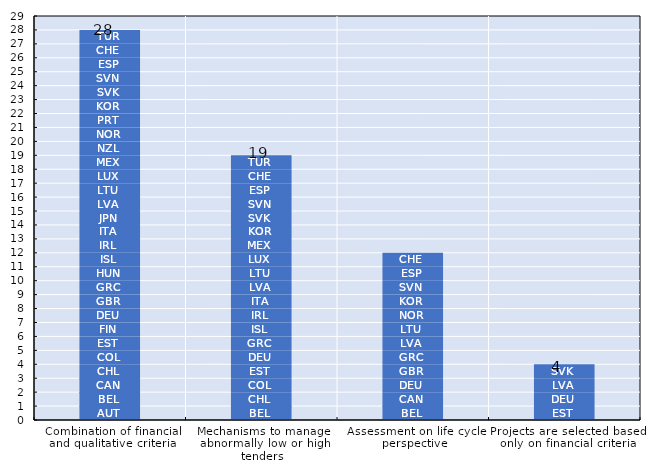
| Category | AUT | BEL | CAN | CHL | COL | CZE | EST | FIN | DEU | GBR | GRC | HUN | ISL | IRL | ITA | JPN | LVA | LTU | LUX | MEX | NZL | NOR | PRT | KOR | SVK | SVN | ESP | CHE | TUR | USA |
|---|---|---|---|---|---|---|---|---|---|---|---|---|---|---|---|---|---|---|---|---|---|---|---|---|---|---|---|---|---|---|
| Combination of financial and qualitative criteria | 1 | 1 | 1 | 1 | 1 | 0 | 1 | 1 | 1 | 1 | 1 | 1 | 1 | 1 | 1 | 1 | 1 | 1 | 1 | 1 | 1 | 1 | 1 | 1 | 1 | 1 | 1 | 1 | 1 | 0 |
| Mechanisms to manage abnormally low or high tenders | 0 | 1 | 0 | 1 | 1 | 0 | 1 | 0 | 1 | 0 | 1 | 0 | 1 | 1 | 1 | 0 | 1 | 1 | 1 | 1 | 0 | 0 | 0 | 1 | 1 | 1 | 1 | 1 | 1 | 0 |
| Assessment on life cycle perspective | 0 | 1 | 1 | 0 | 0 | 0 | 0 | 0 | 1 | 1 | 1 | 0 | 0 | 0 | 0 | 0 | 1 | 1 | 0 | 0 | 0 | 1 | 0 | 1 | 0 | 1 | 1 | 1 | 0 | 0 |
| Projects are selected based only on financial criteria | 0 | 0 | 0 | 0 | 0 | 0 | 1 | 0 | 1 | 0 | 0 | 0 | 0 | 0 | 0 | 0 | 1 | 0 | 0 | 0 | 0 | 0 | 0 | 0 | 1 | 0 | 0 | 0 | 0 | 0 |